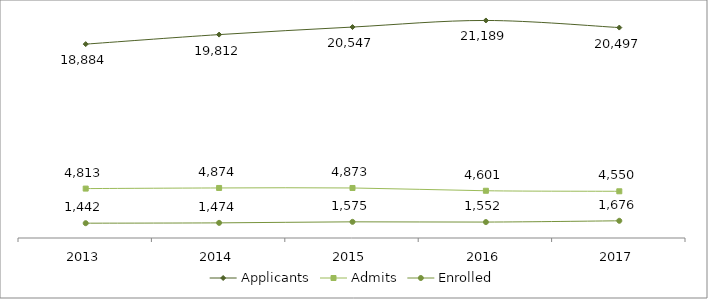
| Category | Applicants | Admits | Enrolled |
|---|---|---|---|
| 2013 | 18884 | 4813 | 1442 |
| 2014 | 19812 | 4874 | 1474 |
| 2015 | 20547 | 4873 | 1575 |
| 2016 | 21189 | 4601 | 1552 |
| 2017 | 20497 | 4550 | 1676 |